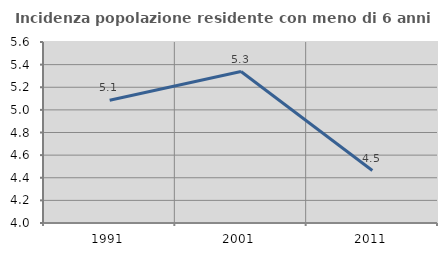
| Category | Incidenza popolazione residente con meno di 6 anni |
|---|---|
| 1991.0 | 5.086 |
| 2001.0 | 5.339 |
| 2011.0 | 4.464 |